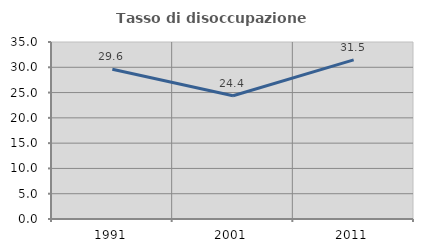
| Category | Tasso di disoccupazione giovanile  |
|---|---|
| 1991.0 | 29.623 |
| 2001.0 | 24.363 |
| 2011.0 | 31.472 |